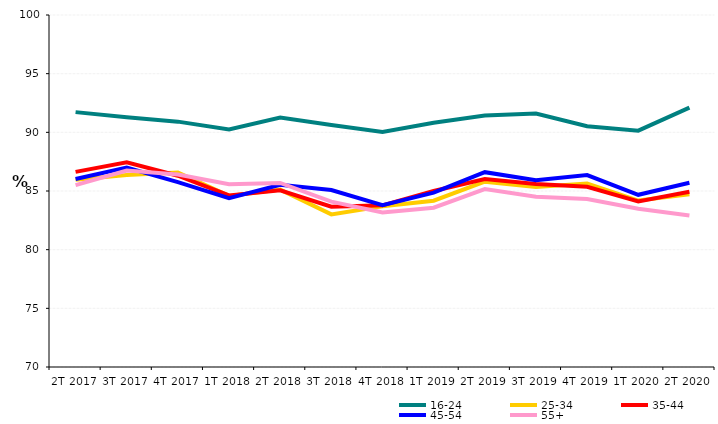
| Category | 16-24 | 25-34 | 35-44 | 45-54 | 55+ |
|---|---|---|---|---|---|
| 2T 2017 | 91.722 | 85.96 | 86.631 | 86.021 | 85.504 |
| 3T 2017 | 91.284 | 86.362 | 87.454 | 87.005 | 86.75 |
| 4T 2017 | 90.911 | 86.567 | 86.302 | 85.756 | 86.412 |
| 1T 2018 | 90.253 | 84.582 | 84.627 | 84.392 | 85.573 |
| 2T 2018 | 91.259 | 85.119 | 85.062 | 85.527 | 85.689 |
| 3T 2018 | 90.632 | 83.005 | 83.657 | 85.08 | 84.098 |
| 4T 2018 | 90.031 | 83.701 | 83.781 | 83.798 | 83.164 |
| 1T 2019 | 90.816 | 84.176 | 85.003 | 84.856 | 83.576 |
| 2T 2019 | 91.425 | 85.797 | 86.023 | 86.604 | 85.16 |
| 3T 2019 | 91.595 | 85.347 | 85.592 | 85.917 | 84.513 |
| 4T 2019 | 90.521 | 85.639 | 85.355 | 86.356 | 84.311 |
| 1T 2020 | 90.146 | 84.186 | 84.114 | 84.676 | 83.491 |
| 2T 2020 | 92.106 | 84.718 | 84.937 | 85.7 | 82.92 |